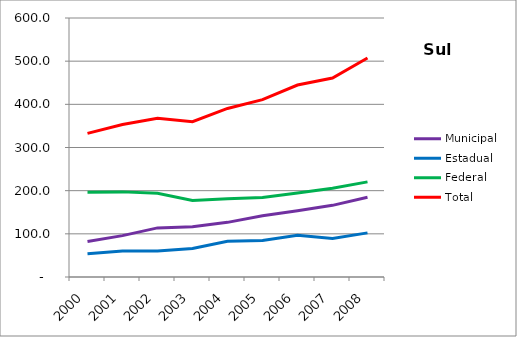
| Category | Municipal | Estadual | Federal | Total |
|---|---|---|---|---|
| 2000.0 | 82.4 | 53.9 | 196.5 | 332.7 |
| 2001.0 | 95.8 | 60.4 | 197.2 | 353.3 |
| 2002.0 | 113.8 | 60.2 | 193.8 | 367.8 |
| 2003.0 | 116.3 | 66.1 | 177.4 | 359.8 |
| 2004.0 | 126.6 | 82.9 | 181 | 390.5 |
| 2005.0 | 142.1 | 84.8 | 184 | 410.9 |
| 2006.0 | 153.6 | 96.5 | 194.6 | 444.7 |
| 2007.0 | 166 | 89.3 | 205.7 | 460.9 |
| 2008.0 | 184.6 | 102.2 | 220.4 | 507.3 |